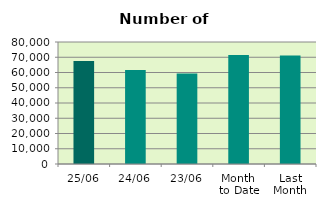
| Category | Series 0 |
|---|---|
| 25/06 | 67498 |
| 24/06 | 61622 |
| 23/06 | 59402 |
| Month 
to Date | 71440.947 |
| Last
Month | 71072.3 |